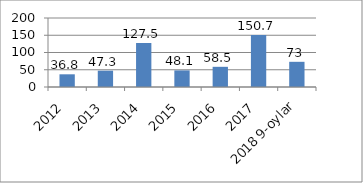
| Category | Series 0 |
|---|---|
| 2012 | 36.8 |
| 2013 | 47.3 |
| 2014 | 127.5 |
| 2015 | 48.1 |
| 2016 | 58.5 |
| 2017 | 150.7 |
| 2018 9-oylar | 73 |